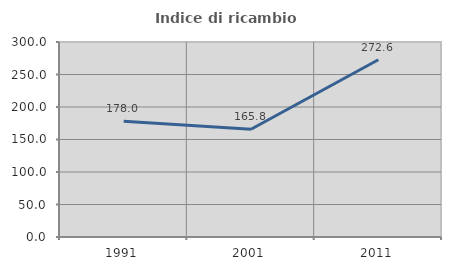
| Category | Indice di ricambio occupazionale  |
|---|---|
| 1991.0 | 178.049 |
| 2001.0 | 165.789 |
| 2011.0 | 272.619 |